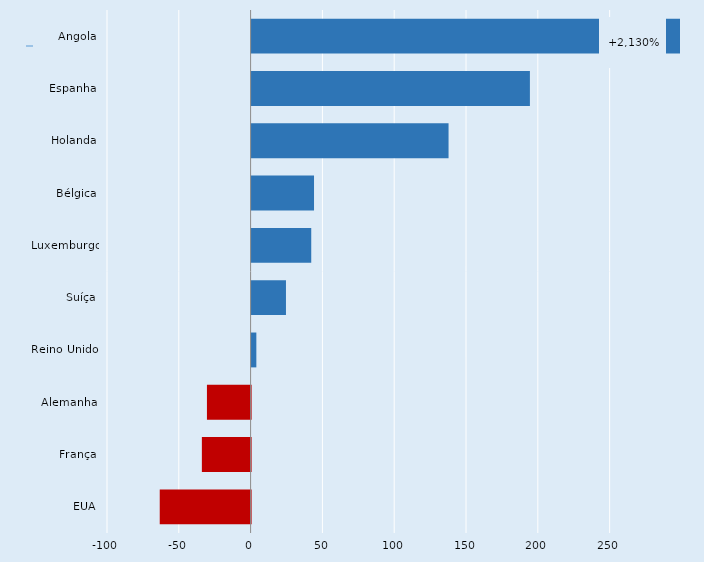
| Category | Series 0 |
|---|---|
| Angola | 300 |
| Espanha | 193.787 |
| Holanda | 137.141 |
| Bélgica | 43.462 |
|      Luxemburgo | 41.529 |
| Suíça | 23.927 |
| Reino Unido | 3.3 |
| Alemanha | -30.408 |
| França | -33.942 |
| EUA | -63.275 |